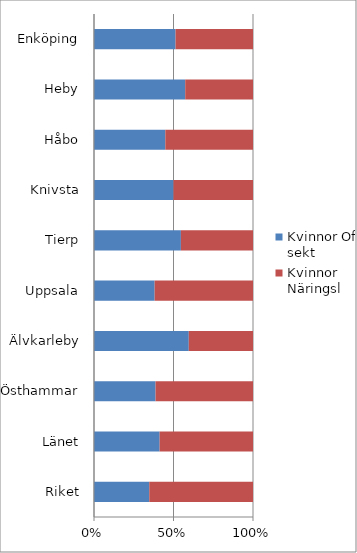
| Category | Kvinnor Off sekt | Kvinnor Näringsl |
|---|---|---|
| Enköping | 51.293 | 48.707 |
| Heby | 57.377 | 42.623 |
| Håbo | 44.86 | 55.14 |
| Knivsta | 50 | 50 |
| Tierp | 54.651 | 45.349 |
| Uppsala | 38.132 | 61.868 |
| Älvkarleby | 59.615 | 40.385 |
| Östhammar | 38.71 | 61.29 |
| Länet | 41.289 | 58.711 |
| Riket | 34.767 | 65.233 |